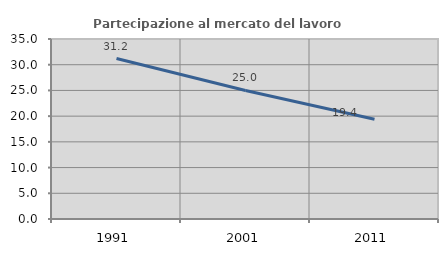
| Category | Partecipazione al mercato del lavoro  femminile |
|---|---|
| 1991.0 | 31.203 |
| 2001.0 | 25 |
| 2011.0 | 19.409 |